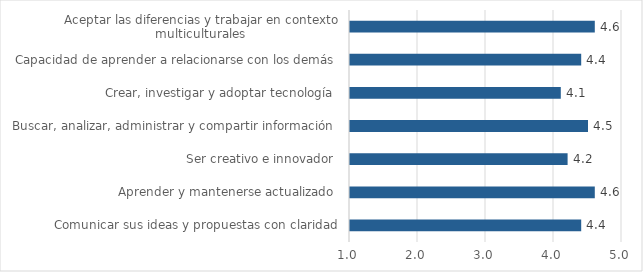
| Category | Series 5 | Promedio |
|---|---|---|
| Comunicar sus ideas y propuestas con claridad |  | 4.4 |
| Aprender y mantenerse actualizado  |  | 4.6 |
| Ser creativo e innovador  |  | 4.2 |
| Buscar, analizar, administrar y compartir información  |  | 4.5 |
| Crear, investigar y adoptar tecnología  |  | 4.1 |
| Capacidad de aprender a relacionarse con los demás  |  | 4.4 |
| Aceptar las diferencias y trabajar en contexto multiculturales  |  | 4.6 |